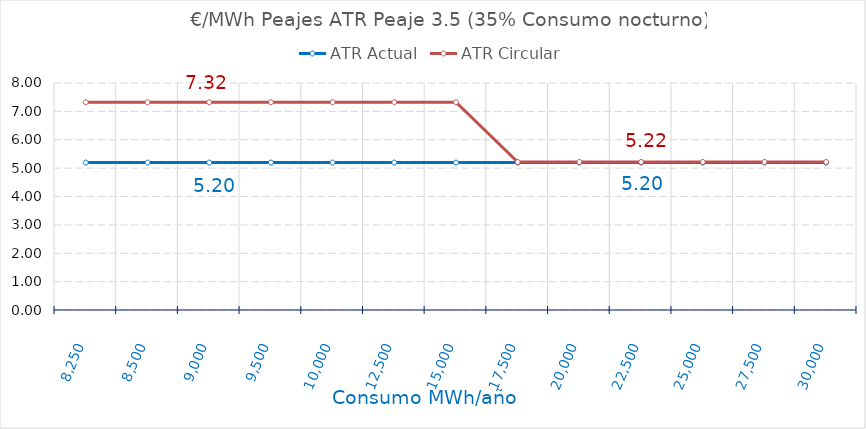
| Category | ATR Actual | ATR Circular |
|---|---|---|
| 8250.0 | 5.195 | 7.322 |
| 8500.0 | 5.195 | 7.322 |
| 9000.0 | 5.195 | 7.322 |
| 9500.0 | 5.195 | 7.322 |
| 10000.0 | 5.195 | 7.322 |
| 12500.0 | 5.195 | 7.322 |
| 15000.0 | 5.195 | 7.322 |
| 17500.0 | 5.195 | 5.216 |
| 20000.0 | 5.195 | 5.216 |
| 22500.0 | 5.195 | 5.216 |
| 25000.0 | 5.195 | 5.216 |
| 27500.0 | 5.195 | 5.216 |
| 30000.0 | 5.195 | 5.216 |